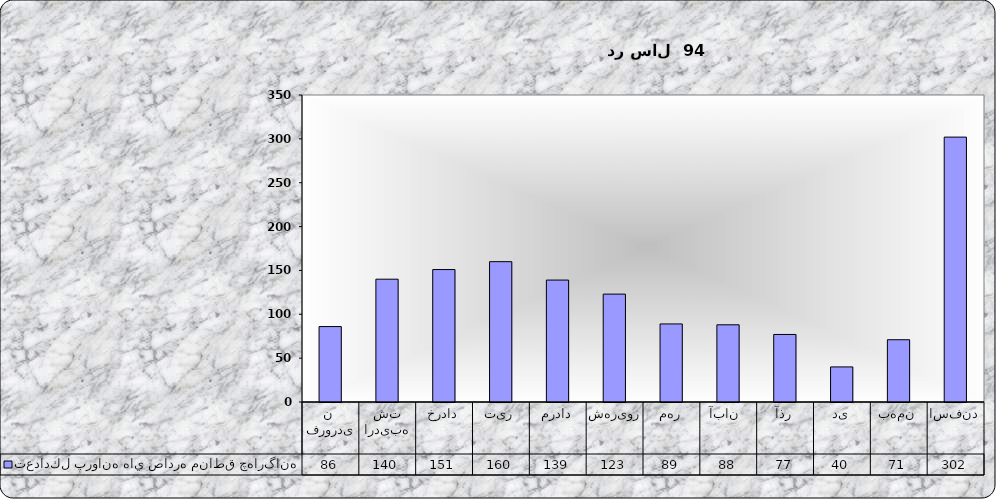
| Category | تعدادكل پروانه هاي صادره مناطق چهارگانه |
|---|---|
| فروردین  | 86 |
| اردیبهشت | 140 |
| خرداد | 151 |
| تیر | 160 |
| مرداد | 139 |
| شهریور | 123 |
| مهر | 89 |
| آبان  | 88 |
| آذر | 77 |
| دی | 40 |
| بهمن | 71 |
| اسفند | 302 |